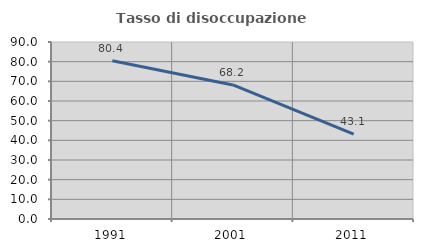
| Category | Tasso di disoccupazione giovanile  |
|---|---|
| 1991.0 | 80.42 |
| 2001.0 | 68.182 |
| 2011.0 | 43.103 |